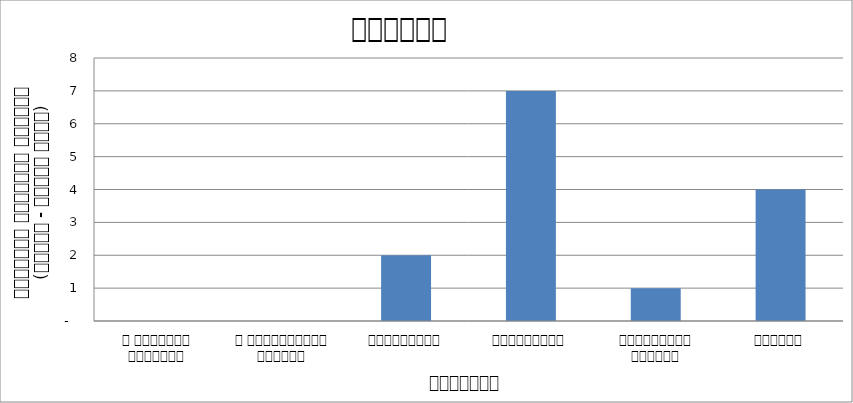
| Category | शिक्षा |
|---|---|
| द हिमालयन टाइम्स् | 0 |
| द काठमाण्डौं पोस्ट् | 0 |
| रिपब्लिका | 2 |
| कान्तिपुर | 7 |
| अन्नपूर्ण पोस्ट् | 1 |
| नागरिक | 4 |